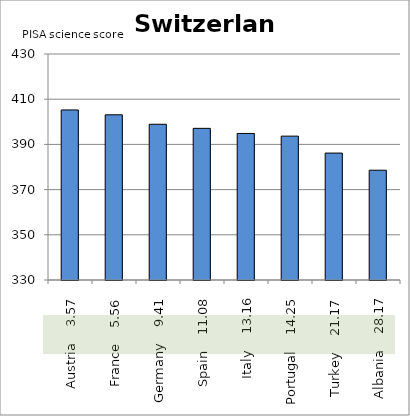
| Category | Switzerland |
|---|---|
| Austria    3.57 | 405.246 |
| France    5.56 | 403.09 |
| Germany    9.41 | 398.916 |
| Spain    11.08 | 397.102 |
| Italy    13.16 | 394.842 |
| Portugal    14.25 | 393.66 |
| Turkey    21.17 | 386.16 |
| Albania    28.17 | 378.569 |